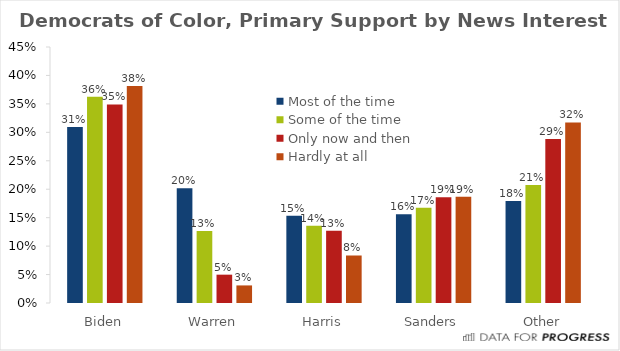
| Category | Most of the time | Some of the time | Only now and then | Hardly at all |
|---|---|---|---|---|
| Biden | 0.31 | 0.363 | 0.349 | 0.381 |
| Warren | 0.202 | 0.126 | 0.05 | 0.031 |
| Harris | 0.153 | 0.136 | 0.127 | 0.084 |
| Sanders | 0.156 | 0.168 | 0.186 | 0.187 |
| Other | 0.179 | 0.208 | 0.288 | 0.317 |